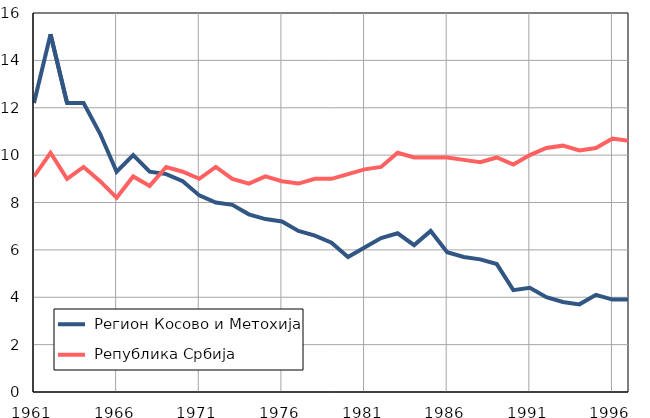
| Category |  Регион Косово и Метохија |  Република Србија |
|---|---|---|
| 1961.0 | 12.2 | 9.1 |
| 1962.0 | 15.1 | 10.1 |
| 1963.0 | 12.2 | 9 |
| 1964.0 | 12.2 | 9.5 |
| 1965.0 | 10.9 | 8.9 |
| 1966.0 | 9.3 | 8.2 |
| 1967.0 | 10 | 9.1 |
| 1968.0 | 9.3 | 8.7 |
| 1969.0 | 9.2 | 9.5 |
| 1970.0 | 8.9 | 9.3 |
| 1971.0 | 8.3 | 9 |
| 1972.0 | 8 | 9.5 |
| 1973.0 | 7.9 | 9 |
| 1974.0 | 7.5 | 8.8 |
| 1975.0 | 7.3 | 9.1 |
| 1976.0 | 7.2 | 8.9 |
| 1977.0 | 6.8 | 8.8 |
| 1978.0 | 6.6 | 9 |
| 1979.0 | 6.3 | 9 |
| 1980.0 | 5.7 | 9.2 |
| 1981.0 | 6.1 | 9.4 |
| 1982.0 | 6.5 | 9.5 |
| 1983.0 | 6.7 | 10.1 |
| 1984.0 | 6.2 | 9.9 |
| 1985.0 | 6.8 | 9.9 |
| 1986.0 | 5.9 | 9.9 |
| 1987.0 | 5.7 | 9.8 |
| 1988.0 | 5.6 | 9.7 |
| 1989.0 | 5.4 | 9.9 |
| 1990.0 | 4.3 | 9.6 |
| 1991.0 | 4.4 | 10 |
| 1992.0 | 4 | 10.3 |
| 1993.0 | 3.8 | 10.4 |
| 1994.0 | 3.7 | 10.2 |
| 1995.0 | 4.1 | 10.3 |
| 1996.0 | 3.9 | 10.7 |
| 1997.0 | 3.9 | 10.6 |